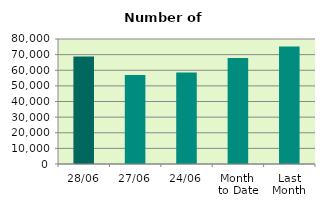
| Category | Series 0 |
|---|---|
| 28/06 | 68750 |
| 27/06 | 57016 |
| 24/06 | 58620 |
| Month 
to Date | 67798.3 |
| Last
Month | 75261.143 |